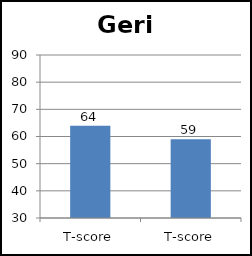
| Category | Geri |
|---|---|
| T-score | 64 |
| T-score | 59 |